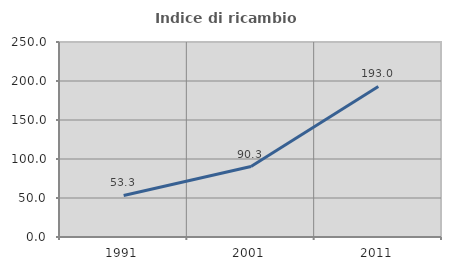
| Category | Indice di ricambio occupazionale  |
|---|---|
| 1991.0 | 53.275 |
| 2001.0 | 90.33 |
| 2011.0 | 192.958 |